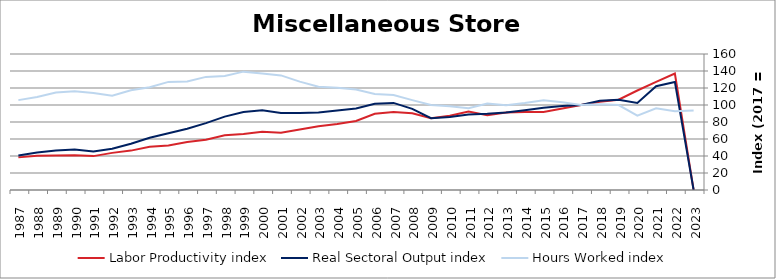
| Category | Labor Productivity index | Real Sectoral Output index | Hours Worked index |
|---|---|---|---|
| 2023.0 | 0 | 0 | 93.66 |
| 2022.0 | 137.041 | 127.134 | 92.771 |
| 2021.0 | 127.186 | 122.15 | 96.041 |
| 2020.0 | 117.051 | 102.484 | 87.555 |
| 2019.0 | 106.249 | 106.195 | 99.949 |
| 2018.0 | 103.902 | 104.908 | 100.968 |
| 2017.0 | 100 | 100 | 100 |
| 2016.0 | 95.834 | 98.922 | 103.222 |
| 2015.0 | 91.83 | 96.883 | 105.502 |
| 2014.0 | 91.699 | 93.736 | 102.221 |
| 2013.0 | 91.197 | 91.064 | 99.853 |
| 2012.0 | 87.997 | 89.585 | 101.804 |
| 2011.0 | 92.34 | 88.764 | 96.127 |
| 2010.0 | 87.321 | 85.932 | 98.41 |
| 2009.0 | 84.406 | 84.44 | 100.04 |
| 2008.0 | 90.248 | 95.454 | 105.769 |
| 2007.0 | 91.724 | 102.457 | 111.702 |
| 2006.0 | 89.69 | 101.341 | 112.991 |
| 2005.0 | 81.255 | 96.002 | 118.149 |
| 2004.0 | 77.715 | 93.432 | 120.224 |
| 2003.0 | 75.033 | 91.176 | 121.515 |
| 2002.0 | 71.154 | 90.732 | 127.515 |
| 2001.0 | 67.232 | 90.633 | 134.807 |
| 2000.0 | 68.473 | 93.823 | 137.02 |
| 1999.0 | 65.946 | 91.823 | 139.241 |
| 1998.0 | 64.388 | 86.358 | 134.122 |
| 1997.0 | 59.106 | 78.658 | 133.078 |
| 1996.0 | 56.514 | 72.137 | 127.643 |
| 1995.0 | 52.475 | 66.734 | 127.172 |
| 1994.0 | 50.813 | 61.435 | 120.904 |
| 1993.0 | 46.336 | 54.357 | 117.312 |
| 1992.0 | 43.672 | 48.444 | 110.926 |
| 1991.0 | 39.861 | 45.446 | 114.011 |
| 1990.0 | 40.971 | 47.594 | 116.165 |
| 1989.0 | 40.522 | 46.498 | 114.747 |
| 1988.0 | 40.314 | 44.118 | 109.438 |
| 1987.0 | 38.385 | 40.582 | 105.722 |